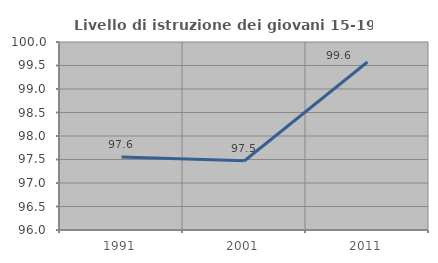
| Category | Livello di istruzione dei giovani 15-19 anni |
|---|---|
| 1991.0 | 97.556 |
| 2001.0 | 97.473 |
| 2011.0 | 99.574 |